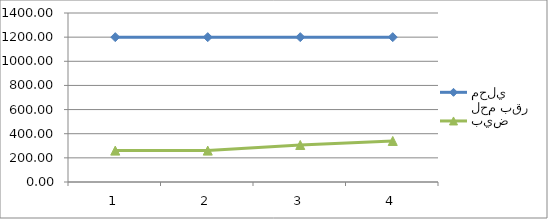
| Category | لحم بقر محلي | بيض |
|---|---|---|
| 0 | 1200 | 260 |
| 1 | 1200 | 260 |
| 2 | 1200 | 306.67 |
| 3 | 1200 | 340 |